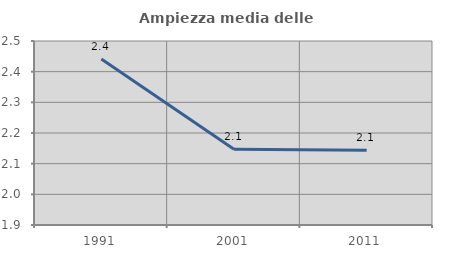
| Category | Ampiezza media delle famiglie |
|---|---|
| 1991.0 | 2.442 |
| 2001.0 | 2.147 |
| 2011.0 | 2.143 |